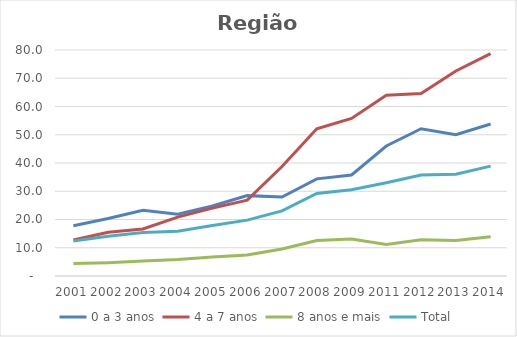
| Category | 0 a 3 anos | 4 a 7 anos | 8 anos e mais | Total |
|---|---|---|---|---|
| 2001.0 | 17.787 | 12.717 | 4.439 | 12.429 |
| 2002.0 | 20.346 | 15.461 | 4.729 | 14.065 |
| 2003.0 | 23.287 | 16.664 | 5.291 | 15.414 |
| 2004.0 | 21.884 | 20.852 | 5.82 | 15.855 |
| 2005.0 | 24.771 | 24.034 | 6.723 | 17.866 |
| 2006.0 | 28.449 | 26.835 | 7.399 | 19.78 |
| 2007.0 | 27.953 | 38.767 | 9.569 | 23.036 |
| 2008.0 | 34.392 | 52.121 | 12.554 | 29.207 |
| 2009.0 | 35.75 | 55.773 | 13.123 | 30.538 |
| 2011.0 | 46.026 | 63.947 | 11.171 | 32.999 |
| 2012.0 | 52.13 | 64.602 | 12.794 | 35.751 |
| 2013.0 | 50.026 | 72.578 | 12.601 | 36.057 |
| 2014.0 | 53.817 | 78.732 | 13.891 | 38.882 |